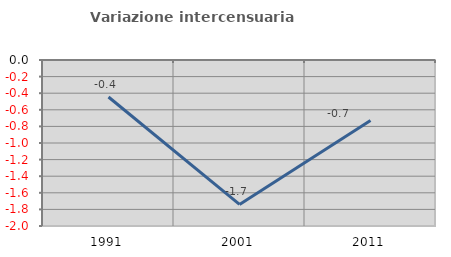
| Category | Variazione intercensuaria annua |
|---|---|
| 1991.0 | -0.446 |
| 2001.0 | -1.74 |
| 2011.0 | -0.73 |